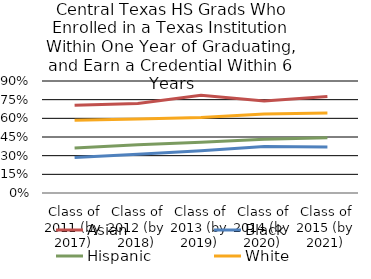
| Category | Asian | Black | Hispanic | White |
|---|---|---|---|---|
| Class of 2011 (by 2017) | 0.705 | 0.285 | 0.362 | 0.585 |
| Class of 2012 (by 2018) | 0.719 | 0.312 | 0.388 | 0.595 |
| Class of 2013 (by 2019) | 0.786 | 0.339 | 0.407 | 0.607 |
| Class of 2014 (by 2020) | 0.74 | 0.373 | 0.431 | 0.634 |
| Class of 2015 (by 2021) | 0.775 | 0.37 | 0.443 | 0.642 |